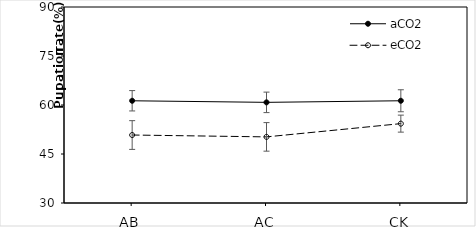
| Category | aCO2 | eCO2 |
|---|---|---|
| AB | 61.295 | 50.81 |
| AC | 60.81 | 50.24 |
| CK | 61.3 | 54.295 |